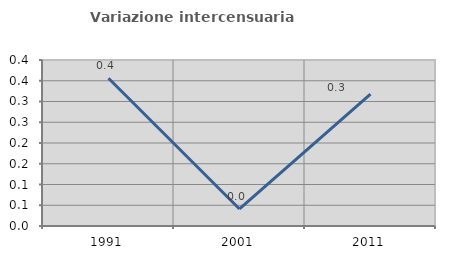
| Category | Variazione intercensuaria annua |
|---|---|
| 1991.0 | 0.356 |
| 2001.0 | 0.041 |
| 2011.0 | 0.318 |